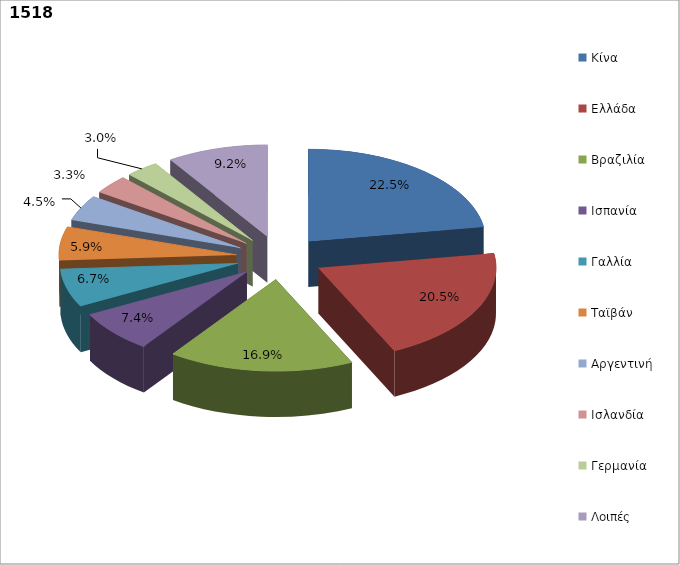
| Category | Series 0 |
|---|---|
| Κίνα | 0.225 |
| Ελλάδα | 0.205 |
| Βραζιλία | 0.169 |
| Ισπανία | 0.074 |
| Γαλλία | 0.067 |
| Ταϊβάν | 0.059 |
| Αργεντινή | 0.045 |
| Ισλανδία | 0.033 |
| Γερμανία | 0.03 |
| Λοιπές | 0.092 |